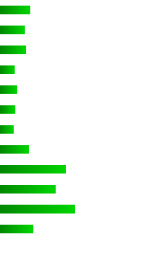
| Category | Series 0 |
|---|---|
| 0 | 758089 |
| 1 | 620299 |
| 2 | 650678 |
| 3 | 356740 |
| 4 | 418574 |
| 5 | 368757 |
| 6 | 332204 |
| 7 | 726194 |
| 8 | 1687112 |
| 9 | 1421920 |
| 10 | 1922685 |
| 11 | 836286 |